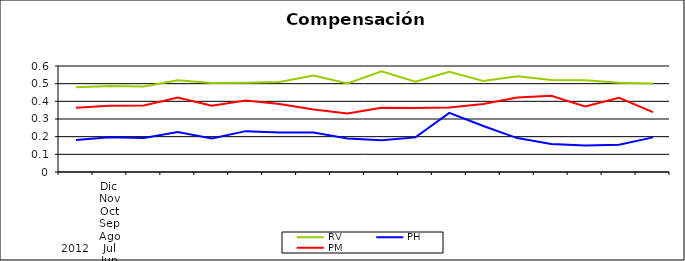
| Category | RV | PH | PM |
|---|---|---|---|
| 0 | 0.479 | 0.181 | 0.364 |
| 1 | 0.487 | 0.196 | 0.375 |
| 2 | 0.484 | 0.192 | 0.376 |
| 3 | 0.52 | 0.226 | 0.421 |
| 4 | 0.504 | 0.189 | 0.375 |
| 5 | 0.506 | 0.231 | 0.404 |
| 6 | 0.51 | 0.224 | 0.384 |
| 7 | 0.546 | 0.223 | 0.353 |
| 8 | 0.501 | 0.19 | 0.331 |
| 9 | 0.57 | 0.18 | 0.364 |
| 10 | 0.511 | 0.196 | 0.363 |
| 11 | 0.567 | 0.335 | 0.365 |
| 12 | 0.515 | 0.26 | 0.385 |
| 13 | 0.543 | 0.192 | 0.422 |
| 14 | 0.52 | 0.158 | 0.431 |
| 15 | 0.519 | 0.15 | 0.371 |
| 16 | 0.505 | 0.154 | 0.42 |
| 17 | 0.501 | 0.196 | 0.339 |